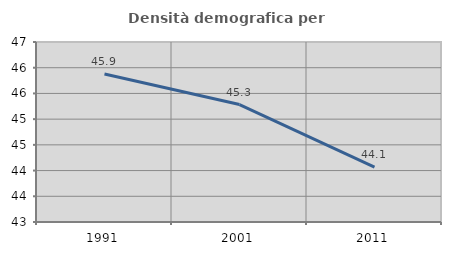
| Category | Densità demografica |
|---|---|
| 1991.0 | 45.879 |
| 2001.0 | 45.284 |
| 2011.0 | 44.068 |